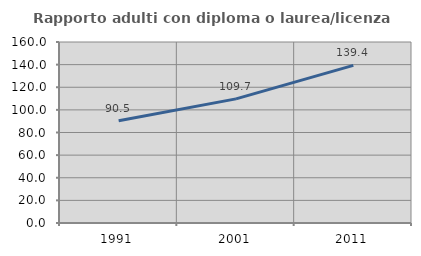
| Category | Rapporto adulti con diploma o laurea/licenza media  |
|---|---|
| 1991.0 | 90.464 |
| 2001.0 | 109.724 |
| 2011.0 | 139.387 |